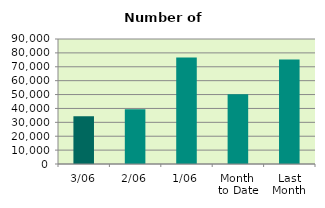
| Category | Series 0 |
|---|---|
| 3/06 | 34334 |
| 2/06 | 39396 |
| 1/06 | 76750 |
| Month 
to Date | 50160 |
| Last
Month | 75261.143 |